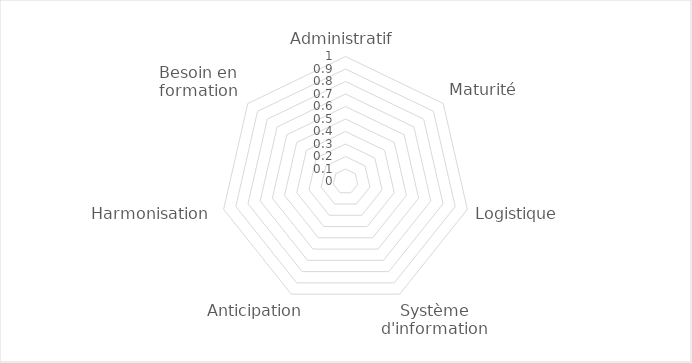
| Category | Series 0 |
|---|---|
| Administratif | 0 |
| Maturité | 0 |
| Logistique | 0 |
| Système d'information | 0 |
| Anticipation | 0 |
| Harmonisation | 0 |
| Besoin en formation | 0 |